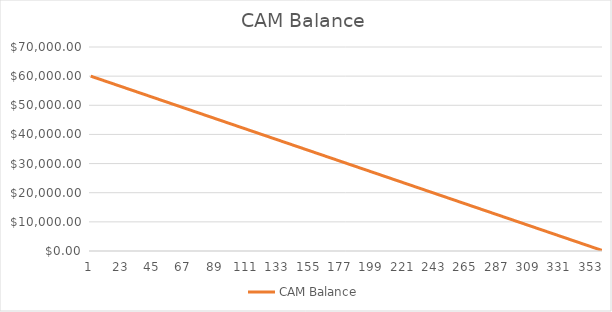
| Category | CAM Balance |
|---|---|
| 0 | 60000 |
| 1 | 59833.333 |
| 2 | 59666.667 |
| 3 | 59500 |
| 4 | 59333.333 |
| 5 | 59166.667 |
| 6 | 59000 |
| 7 | 58833.333 |
| 8 | 58666.667 |
| 9 | 58500 |
| 10 | 58333.333 |
| 11 | 58166.667 |
| 12 | 58000 |
| 13 | 57833.333 |
| 14 | 57666.667 |
| 15 | 57500 |
| 16 | 57333.333 |
| 17 | 57166.667 |
| 18 | 57000 |
| 19 | 56833.333 |
| 20 | 56666.667 |
| 21 | 56500 |
| 22 | 56333.333 |
| 23 | 56166.667 |
| 24 | 56000 |
| 25 | 55833.333 |
| 26 | 55666.667 |
| 27 | 55500 |
| 28 | 55333.333 |
| 29 | 55166.667 |
| 30 | 55000 |
| 31 | 54833.333 |
| 32 | 54666.667 |
| 33 | 54500 |
| 34 | 54333.333 |
| 35 | 54166.667 |
| 36 | 54000 |
| 37 | 53833.333 |
| 38 | 53666.667 |
| 39 | 53500 |
| 40 | 53333.333 |
| 41 | 53166.667 |
| 42 | 53000 |
| 43 | 52833.333 |
| 44 | 52666.667 |
| 45 | 52500 |
| 46 | 52333.333 |
| 47 | 52166.667 |
| 48 | 52000 |
| 49 | 51833.333 |
| 50 | 51666.667 |
| 51 | 51500 |
| 52 | 51333.333 |
| 53 | 51166.667 |
| 54 | 51000 |
| 55 | 50833.333 |
| 56 | 50666.667 |
| 57 | 50500 |
| 58 | 50333.333 |
| 59 | 50166.667 |
| 60 | 50000 |
| 61 | 49833.333 |
| 62 | 49666.667 |
| 63 | 49500 |
| 64 | 49333.333 |
| 65 | 49166.667 |
| 66 | 49000 |
| 67 | 48833.333 |
| 68 | 48666.667 |
| 69 | 48500 |
| 70 | 48333.333 |
| 71 | 48166.667 |
| 72 | 48000 |
| 73 | 47833.333 |
| 74 | 47666.667 |
| 75 | 47500 |
| 76 | 47333.333 |
| 77 | 47166.667 |
| 78 | 47000 |
| 79 | 46833.333 |
| 80 | 46666.667 |
| 81 | 46500 |
| 82 | 46333.333 |
| 83 | 46166.667 |
| 84 | 46000 |
| 85 | 45833.333 |
| 86 | 45666.667 |
| 87 | 45500 |
| 88 | 45333.333 |
| 89 | 45166.667 |
| 90 | 45000 |
| 91 | 44833.333 |
| 92 | 44666.667 |
| 93 | 44500 |
| 94 | 44333.333 |
| 95 | 44166.667 |
| 96 | 44000 |
| 97 | 43833.333 |
| 98 | 43666.667 |
| 99 | 43500 |
| 100 | 43333.333 |
| 101 | 43166.667 |
| 102 | 43000 |
| 103 | 42833.333 |
| 104 | 42666.667 |
| 105 | 42500 |
| 106 | 42333.333 |
| 107 | 42166.667 |
| 108 | 42000 |
| 109 | 41833.333 |
| 110 | 41666.667 |
| 111 | 41500 |
| 112 | 41333.333 |
| 113 | 41166.667 |
| 114 | 41000 |
| 115 | 40833.333 |
| 116 | 40666.667 |
| 117 | 40500 |
| 118 | 40333.333 |
| 119 | 40166.667 |
| 120 | 40000 |
| 121 | 39833.333 |
| 122 | 39666.667 |
| 123 | 39500 |
| 124 | 39333.333 |
| 125 | 39166.667 |
| 126 | 39000 |
| 127 | 38833.333 |
| 128 | 38666.667 |
| 129 | 38500 |
| 130 | 38333.333 |
| 131 | 38166.667 |
| 132 | 38000 |
| 133 | 37833.333 |
| 134 | 37666.667 |
| 135 | 37500 |
| 136 | 37333.333 |
| 137 | 37166.667 |
| 138 | 37000 |
| 139 | 36833.333 |
| 140 | 36666.667 |
| 141 | 36500 |
| 142 | 36333.333 |
| 143 | 36166.667 |
| 144 | 36000 |
| 145 | 35833.333 |
| 146 | 35666.667 |
| 147 | 35500 |
| 148 | 35333.333 |
| 149 | 35166.667 |
| 150 | 35000 |
| 151 | 34833.333 |
| 152 | 34666.667 |
| 153 | 34500 |
| 154 | 34333.333 |
| 155 | 34166.667 |
| 156 | 34000 |
| 157 | 33833.333 |
| 158 | 33666.667 |
| 159 | 33500 |
| 160 | 33333.333 |
| 161 | 33166.667 |
| 162 | 33000 |
| 163 | 32833.333 |
| 164 | 32666.667 |
| 165 | 32500 |
| 166 | 32333.333 |
| 167 | 32166.667 |
| 168 | 32000 |
| 169 | 31833.333 |
| 170 | 31666.667 |
| 171 | 31500 |
| 172 | 31333.333 |
| 173 | 31166.667 |
| 174 | 31000 |
| 175 | 30833.333 |
| 176 | 30666.667 |
| 177 | 30500 |
| 178 | 30333.333 |
| 179 | 30166.667 |
| 180 | 30000 |
| 181 | 29833.333 |
| 182 | 29666.667 |
| 183 | 29500 |
| 184 | 29333.333 |
| 185 | 29166.667 |
| 186 | 29000 |
| 187 | 28833.333 |
| 188 | 28666.667 |
| 189 | 28500 |
| 190 | 28333.333 |
| 191 | 28166.667 |
| 192 | 28000 |
| 193 | 27833.333 |
| 194 | 27666.667 |
| 195 | 27500 |
| 196 | 27333.333 |
| 197 | 27166.667 |
| 198 | 27000 |
| 199 | 26833.333 |
| 200 | 26666.667 |
| 201 | 26500 |
| 202 | 26333.333 |
| 203 | 26166.667 |
| 204 | 26000 |
| 205 | 25833.333 |
| 206 | 25666.667 |
| 207 | 25500 |
| 208 | 25333.333 |
| 209 | 25166.667 |
| 210 | 25000 |
| 211 | 24833.333 |
| 212 | 24666.667 |
| 213 | 24500 |
| 214 | 24333.333 |
| 215 | 24166.667 |
| 216 | 24000 |
| 217 | 23833.333 |
| 218 | 23666.667 |
| 219 | 23500 |
| 220 | 23333.333 |
| 221 | 23166.667 |
| 222 | 23000 |
| 223 | 22833.333 |
| 224 | 22666.667 |
| 225 | 22500 |
| 226 | 22333.333 |
| 227 | 22166.667 |
| 228 | 22000 |
| 229 | 21833.333 |
| 230 | 21666.667 |
| 231 | 21500 |
| 232 | 21333.333 |
| 233 | 21166.667 |
| 234 | 21000 |
| 235 | 20833.333 |
| 236 | 20666.667 |
| 237 | 20500 |
| 238 | 20333.333 |
| 239 | 20166.667 |
| 240 | 20000 |
| 241 | 19833.333 |
| 242 | 19666.667 |
| 243 | 19500 |
| 244 | 19333.333 |
| 245 | 19166.667 |
| 246 | 19000 |
| 247 | 18833.333 |
| 248 | 18666.667 |
| 249 | 18500 |
| 250 | 18333.333 |
| 251 | 18166.667 |
| 252 | 18000 |
| 253 | 17833.333 |
| 254 | 17666.667 |
| 255 | 17500 |
| 256 | 17333.333 |
| 257 | 17166.667 |
| 258 | 17000 |
| 259 | 16833.333 |
| 260 | 16666.667 |
| 261 | 16500 |
| 262 | 16333.333 |
| 263 | 16166.667 |
| 264 | 16000 |
| 265 | 15833.333 |
| 266 | 15666.667 |
| 267 | 15500 |
| 268 | 15333.333 |
| 269 | 15166.667 |
| 270 | 15000 |
| 271 | 14833.333 |
| 272 | 14666.667 |
| 273 | 14500 |
| 274 | 14333.333 |
| 275 | 14166.667 |
| 276 | 14000 |
| 277 | 13833.333 |
| 278 | 13666.667 |
| 279 | 13500 |
| 280 | 13333.333 |
| 281 | 13166.667 |
| 282 | 13000 |
| 283 | 12833.333 |
| 284 | 12666.667 |
| 285 | 12500 |
| 286 | 12333.333 |
| 287 | 12166.667 |
| 288 | 12000 |
| 289 | 11833.333 |
| 290 | 11666.667 |
| 291 | 11500 |
| 292 | 11333.333 |
| 293 | 11166.667 |
| 294 | 11000 |
| 295 | 10833.333 |
| 296 | 10666.667 |
| 297 | 10500 |
| 298 | 10333.333 |
| 299 | 10166.667 |
| 300 | 10000 |
| 301 | 9833.333 |
| 302 | 9666.667 |
| 303 | 9500 |
| 304 | 9333.333 |
| 305 | 9166.667 |
| 306 | 9000 |
| 307 | 8833.333 |
| 308 | 8666.667 |
| 309 | 8500 |
| 310 | 8333.333 |
| 311 | 8166.667 |
| 312 | 8000 |
| 313 | 7833.333 |
| 314 | 7666.667 |
| 315 | 7500 |
| 316 | 7333.333 |
| 317 | 7166.667 |
| 318 | 7000 |
| 319 | 6833.333 |
| 320 | 6666.667 |
| 321 | 6500 |
| 322 | 6333.333 |
| 323 | 6166.667 |
| 324 | 6000 |
| 325 | 5833.333 |
| 326 | 5666.667 |
| 327 | 5500 |
| 328 | 5333.333 |
| 329 | 5166.667 |
| 330 | 5000 |
| 331 | 4833.333 |
| 332 | 4666.667 |
| 333 | 4500 |
| 334 | 4333.333 |
| 335 | 4166.667 |
| 336 | 4000 |
| 337 | 3833.333 |
| 338 | 3666.667 |
| 339 | 3500 |
| 340 | 3333.333 |
| 341 | 3166.667 |
| 342 | 3000 |
| 343 | 2833.333 |
| 344 | 2666.667 |
| 345 | 2500 |
| 346 | 2333.333 |
| 347 | 2166.667 |
| 348 | 2000 |
| 349 | 1833.333 |
| 350 | 1666.667 |
| 351 | 1500 |
| 352 | 1333.333 |
| 353 | 1166.667 |
| 354 | 1000 |
| 355 | 833.333 |
| 356 | 666.667 |
| 357 | 500 |
| 358 | 333.333 |
| 359 | 166.667 |